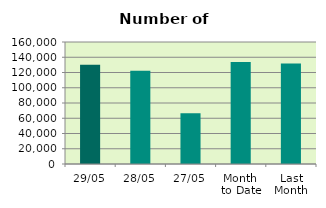
| Category | Series 0 |
|---|---|
| 29/05 | 130088 |
| 28/05 | 122436 |
| 27/05 | 66632 |
| Month 
to Date | 133757.4 |
| Last
Month | 131708.5 |